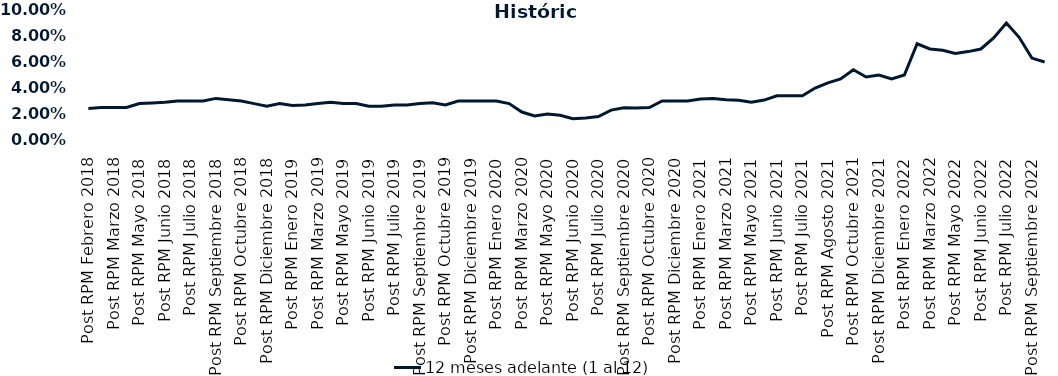
| Category | 12 meses adelante (1 al 12)  |
|---|---|
| Post RPM Febrero 2018 | 0.024 |
| Pre RPM Marzo 2018 | 0.025 |
| Post RPM Marzo 2018 | 0.025 |
| Pre RPM Mayo 2018 | 0.025 |
| Post RPM Mayo 2018 | 0.028 |
| Pre RPM Junio 2018 | 0.028 |
| Post RPM Junio 2018 | 0.029 |
| Pre RPM Julio 2018 | 0.03 |
| Post RPM Julio 2018 | 0.03 |
| Pre RPM Septiembre 2018 | 0.03 |
| Post RPM Septiembre 2018 | 0.032 |
| Pre RPM Octubre 2018 | 0.031 |
| Post RPM Octubre 2018 | 0.03 |
| Pre RPM Diciembre 2018 | 0.028 |
| Post RPM Diciembre 2018 | 0.026 |
| Pre RPM Enero 2019 | 0.028 |
| Post RPM Enero 2019 | 0.026 |
| Pre RPM Marzo 2019 | 0.027 |
| Post RPM Marzo 2019 | 0.028 |
| Pre RPM Mayo 2019 | 0.029 |
| Post RPM Mayo 2019 | 0.028 |
| Pre RPM Junio 2019 | 0.028 |
| Post RPM Junio 2019 | 0.026 |
| Pre RPM Julio 2019 | 0.026 |
| Post RPM Julio 2019 | 0.027 |
| Pre RPM Septiembre 2019 | 0.027 |
| Post RPM Septiembre 2019 | 0.028 |
| Pre RPM Octubre 2019 | 0.029 |
| Post RPM Octubre 2019 | 0.027 |
| Pre RPM Diciembre 2019 | 0.03 |
| Post RPM Diciembre 2019 | 0.03 |
| Pre RPM Enero 2020 | 0.03 |
| Post RPM Enero 2020 | 0.03 |
| Pre RPM Marzo 2020 | 0.028 |
| Post RPM Marzo 2020 | 0.022 |
| Pre RPM Mayo 2020 | 0.018 |
| Post RPM Mayo 2020 | 0.02 |
| Pre RPM Junio 2020 | 0.019 |
| Post RPM Junio 2020 | 0.016 |
| Pre RPM Julio 2020 | 0.017 |
| Post RPM Julio 2020 | 0.018 |
| Pre RPM Septiembre 2020 | 0.023 |
| Post RPM Septiembre 2020 | 0.025 |
| Pre RPM Octubre 2020 | 0.025 |
| Post RPM Octubre 2020 | 0.025 |
| Pre RPM Diciembre 2020 | 0.03 |
| Post RPM Diciembre 2020 | 0.03 |
| Pre RPM Enero 2021 | 0.03 |
| Post RPM Enero 2021 | 0.032 |
| Pre RPM Marzo 2021 | 0.032 |
| Post RPM Marzo 2021 | 0.031 |
| Pre RPM Mayo 2021 | 0.03 |
| Post RPM Mayo 2021 | 0.029 |
| Pre RPM Junio 2021 | 0.031 |
| Post RPM Junio 2021 | 0.034 |
| Pre RPM Julio 2021 | 0.034 |
| Post RPM Julio 2021 | 0.034 |
| Pre RPM Agosto 2021 | 0.04 |
| Post RPM Agosto 2021 | 0.044 |
| Pre RPM Octubre 2021 | 0.047 |
| Post RPM Octubre 2021 | 0.054 |
| Pre RPM Diciembre 2021 | 0.048 |
| Post RPM Diciembre 2021 | 0.05 |
| Pre RPM Enero 2022 | 0.047 |
| Post RPM Enero 2022 | 0.05 |
| Pre RPM Marzo 2022 | 0.074 |
| Post RPM Marzo 2022 | 0.07 |
| Pre RPM Mayo 2022 | 0.069 |
| Post RPM Mayo 2022 | 0.066 |
| Pre RPM Junio 2022 | 0.068 |
| Post RPM Junio 2022 | 0.07 |
| Pre RPM Julio 2022 | 0.078 |
| Post RPM Julio 2022 | 0.09 |
| Pre RPM Septiembre 2022 | 0.079 |
| Post RPM Septiembre 2022 | 0.063 |
| Pre RPM Octubre 2022 | 0.06 |